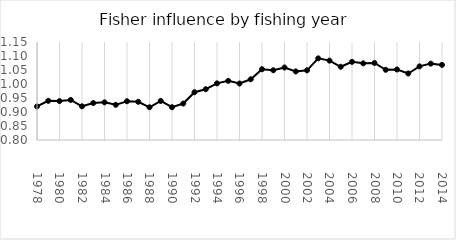
| Category | Series 0 |
|---|---|
| 1978.0 | 0.92 |
| 1979.0 | 0.94 |
| 1980.0 | 0.939 |
| 1981.0 | 0.943 |
| 1982.0 | 0.92 |
| 1983.0 | 0.932 |
| 1984.0 | 0.934 |
| 1985.0 | 0.926 |
| 1986.0 | 0.938 |
| 1987.0 | 0.937 |
| 1988.0 | 0.917 |
| 1989.0 | 0.939 |
| 1990.0 | 0.917 |
| 1991.0 | 0.93 |
| 1992.0 | 0.971 |
| 1993.0 | 0.981 |
| 1994.0 | 1.002 |
| 1995.0 | 1.011 |
| 1996.0 | 1.002 |
| 1997.0 | 1.017 |
| 1998.0 | 1.053 |
| 1999.0 | 1.049 |
| 2000.0 | 1.059 |
| 2001.0 | 1.045 |
| 2002.0 | 1.049 |
| 2003.0 | 1.092 |
| 2004.0 | 1.084 |
| 2005.0 | 1.062 |
| 2006.0 | 1.079 |
| 2007.0 | 1.074 |
| 2008.0 | 1.075 |
| 2009.0 | 1.051 |
| 2010.0 | 1.052 |
| 2011.0 | 1.038 |
| 2012.0 | 1.063 |
| 2013.0 | 1.073 |
| 2014.0 | 1.068 |